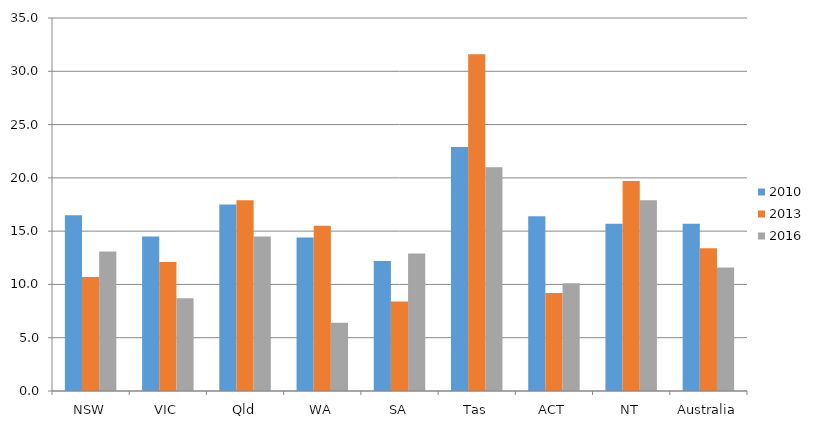
| Category | 2010 | 2013 | 2016 |
|---|---|---|---|
| NSW | 16.5 | 10.7 | 13.1 |
| VIC | 14.5 | 12.1 | 8.7 |
| Qld | 17.5 | 17.9 | 14.5 |
| WA | 14.4 | 15.5 | 6.4 |
| SA | 12.2 | 8.4 | 12.9 |
| Tas | 22.9 | 31.6 | 21 |
| ACT | 16.4 | 9.2 | 10.1 |
| NT | 15.7 | 19.7 | 17.9 |
| Australia | 15.7 | 13.4 | 11.6 |